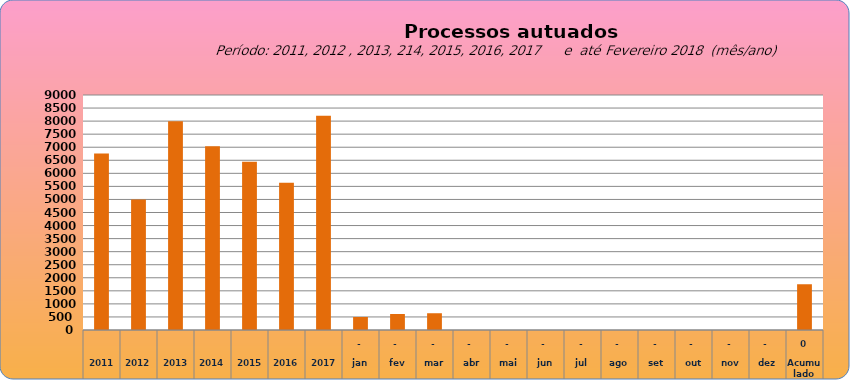
| Category | 6755 |
|---|---|
| 2011 | 6755 |
| 2012 | 4997 |
| 2013 | 7990 |
| 2014 | 7034 |
| 2015 | 6446 |
| 2016 | 5644 |
| 2017 | 8210 |
| jan | 498 |
| fev | 612 |
| mar | 642 |
| abr | 0 |
| mai | 0 |
| jun | 0 |
| jul | 0 |
| ago | 0 |
| set | 0 |
| out | 0 |
| nov | 0 |
| dez | 0 |
| Acumulado
 | 1752 |